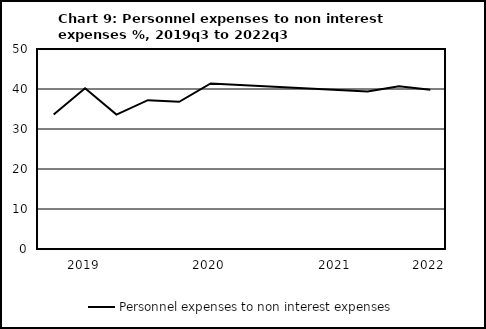
| Category | Personnel expenses to non interest expenses |
|---|---|
| nan | 33.6 |
| 2019.0 | 40.2 |
| nan | 33.6 |
| nan | 37.2 |
| nan | 36.8 |
| 2020.0 | 41.4 |
| nan | 0 |
| nan | 0 |
| nan | 0 |
| 2021.0 | 0 |
| nan | 39.4 |
| nan | 40.7 |
| 2022.0 | 39.8 |